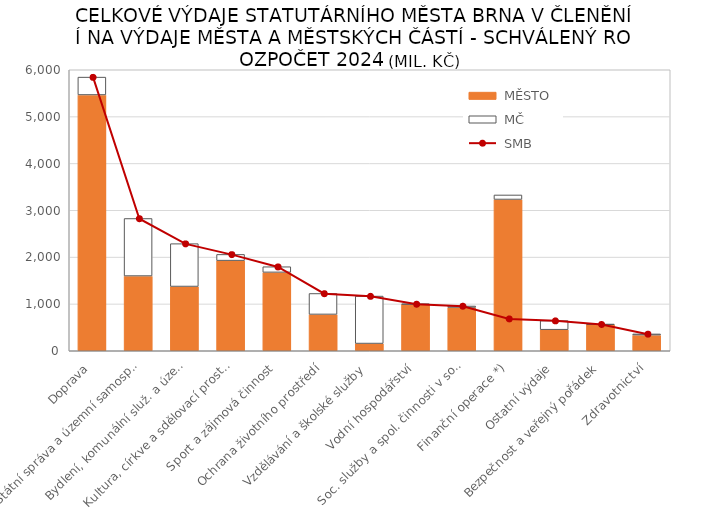
| Category |  MĚSTO |  MČ |
|---|---|---|
|  Doprava | 5462.3 | 380.74 |
|  Státní správa a územní samospráva | 1595.383 | 1229.092 |
|  Bydlení, komunální služ. a územ. rozvoj | 1371.696 | 915.193 |
|  Kultura, církve a sdělovací prostředky | 1924.433 | 133.036 |
|  Sport a zájmová činnost | 1673.804 | 120.7 |
|  Ochrana životního prostředí | 775.772 | 447.583 |
|  Vzdělávání a školské služby | 153.834 | 1013.878 |
|  Vodní hospodářství | 992.033 | 6.742 |
|  Soc. služby a spol. činnosti v soc. zab. | 923.991 | 31.765 |
|  Finanční operace *) | 3230.166 | 96.53 |
|  Ostatní výdaje | 449.904 | 193.805 |
|  Bezpečnost a veřejný pořádek | 560.211 | 5.435 |
|  Zdravotnictví | 334.323 | 25.104 |